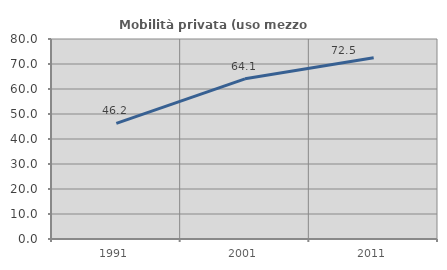
| Category | Mobilità privata (uso mezzo privato) |
|---|---|
| 1991.0 | 46.221 |
| 2001.0 | 64.082 |
| 2011.0 | 72.461 |